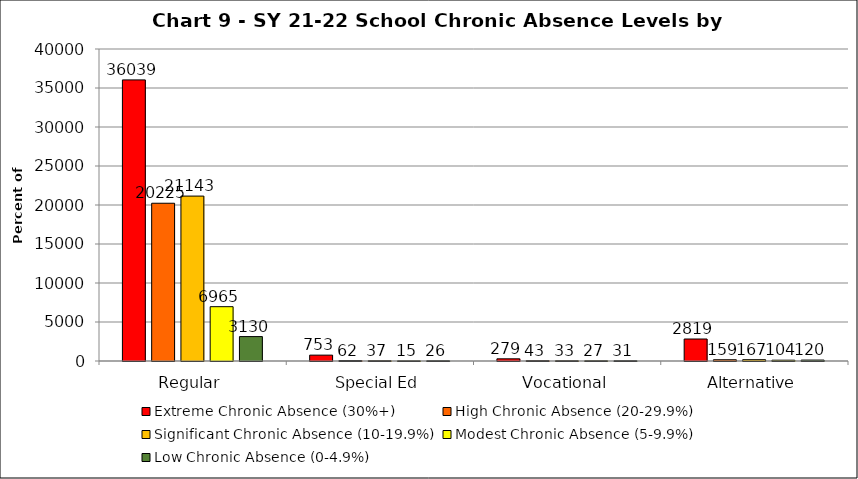
| Category | Extreme Chronic Absence (30%+) | High Chronic Absence (20-29.9%) | Significant Chronic Absence (10-19.9%) | Modest Chronic Absence (5-9.9%) | Low Chronic Absence (0-4.9%) |
|---|---|---|---|---|---|
| 0 | 36039 | 20225 | 21143 | 6965 | 3130 |
| 1 | 753 | 62 | 37 | 15 | 26 |
| 2 | 279 | 43 | 33 | 27 | 31 |
| 3 | 2819 | 159 | 167 | 104 | 120 |